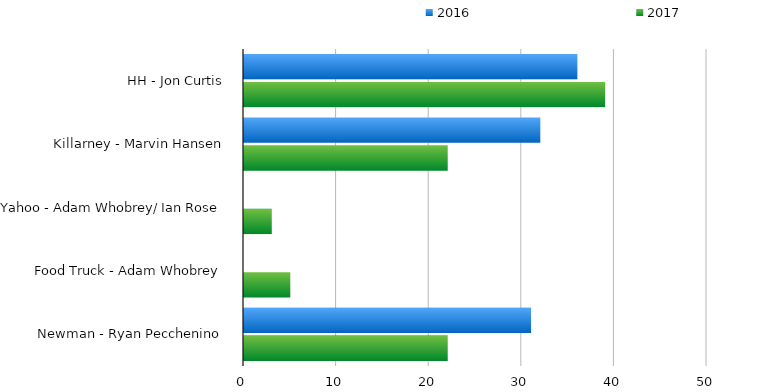
| Category | 2016 | 2017 |
|---|---|---|
| HH - Jon Curtis  | 36 | 39 |
| Killarney - Marvin Hansen  | 32 | 22 |
| Yahoo - Adam Whobrey/ Ian Rose  | 0 | 3 |
| Food Truck - Adam Whobrey  | 0 | 5 |
| Newman - Ryan Pecchenino  | 31 | 22 |